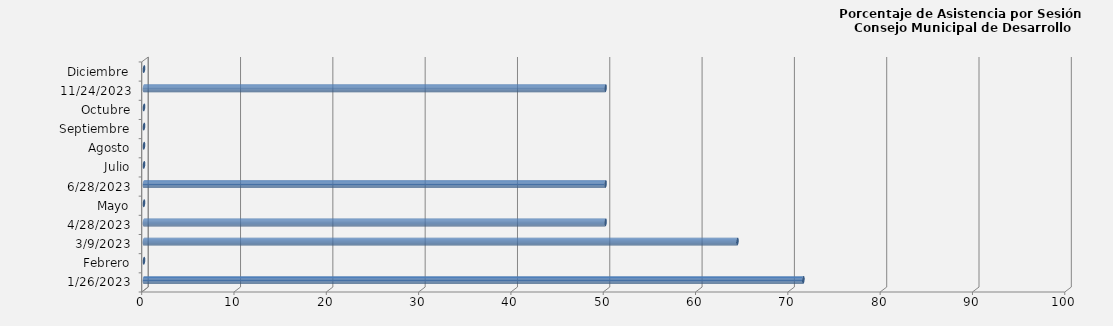
| Category | Series 0 |
|---|---|
| 26/01/2023 | 71.429 |
| Febrero | 0 |
| 09/03/2023 | 64.286 |
| 28/04/2023 | 50 |
| Mayo | 0 |
| 28/06/2023 | 50 |
| Julio | 0 |
| Agosto | 0 |
| Septiembre | 0 |
| Octubre | 0 |
| 24/11/2023 | 50 |
| Diciembre | 0 |